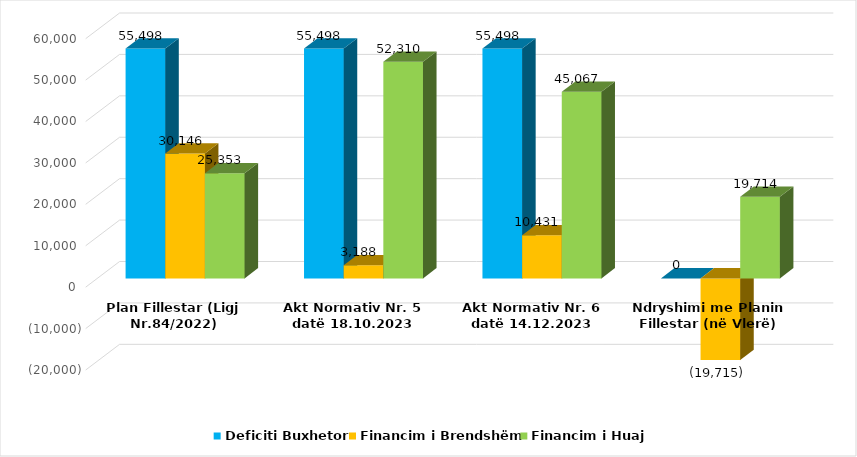
| Category | Deficiti Buxhetor | Financim i Brendshëm | Financim i Huaj |
|---|---|---|---|
| Plan Fillestar (Ligj Nr.84/2022) | 55498 | 30146 | 25353 |
| Akt Normativ Nr. 5 datë 18.10.2023 | 55498 | 3188 | 52310 |
| Akt Normativ Nr. 6 datë 14.12.2023 | 55498 | 10431 | 45067 |
| Ndryshimi me Planin Fillestar (në Vlerë) | 0 | -19715 | 19714 |